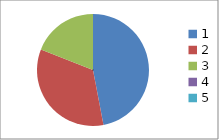
| Category | Series 0 |
|---|---|
| 0 | 0.47 |
| 1 | 0.34 |
| 2 | 0.19 |
| 3 | 0 |
| 4 | 0 |